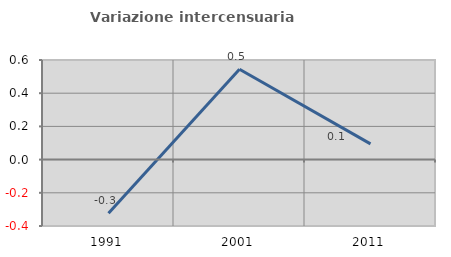
| Category | Variazione intercensuaria annua |
|---|---|
| 1991.0 | -0.323 |
| 2001.0 | 0.544 |
| 2011.0 | 0.095 |